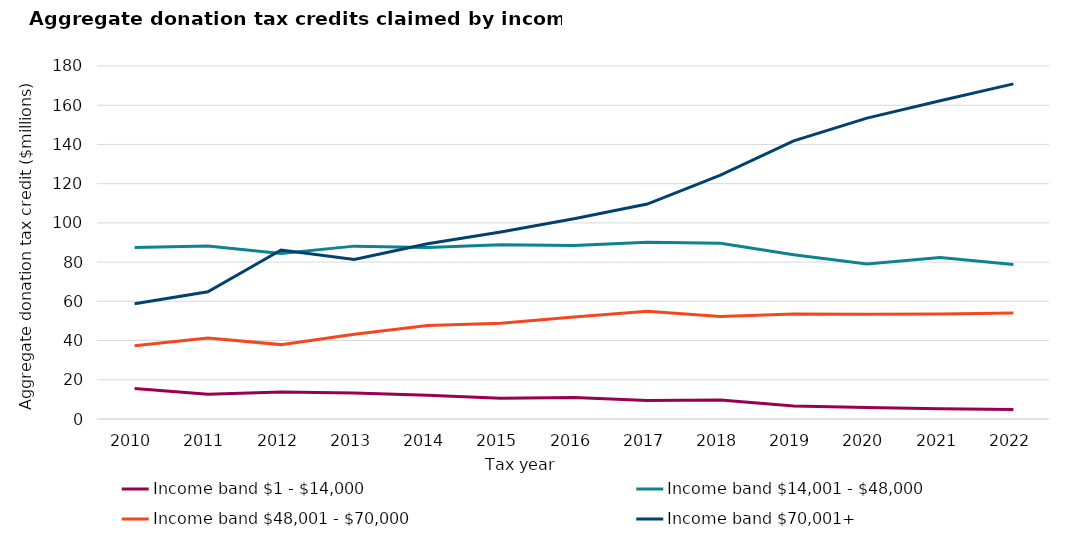
| Category | Income band $1 - $14,000 | Income band $14,001 - $48,000 | Income band $48,001 - $70,000 | Income band $70,001+ |
|---|---|---|---|---|
| 2010.0 | 15.6 | 87.5 | 37.4 | 58.8 |
| 2011.0 | 12.6 | 88.2 | 41.3 | 64.9 |
| 2012.0 | 13.743 | 84.388 | 37.929 | 86.141 |
| 2013.0 | 13.269 | 88.151 | 43.231 | 81.345 |
| 2014.0 | 12.098 | 87.477 | 47.639 | 89.386 |
| 2015.0 | 10.607 | 88.833 | 48.817 | 95.346 |
| 2016.0 | 10.975 | 88.532 | 51.964 | 102.128 |
| 2017.0 | 9.454 | 90.078 | 54.925 | 109.595 |
| 2018.0 | 9.699 | 89.575 | 52.292 | 124.334 |
| 2019.0 | 6.6 | 83.7 | 53.5 | 141.8 |
| 2020.0 | 5.9 | 79.1 | 53.4 | 153.4 |
| 2021.0 | 5.2 | 82.3 | 53.6 | 162.3 |
| 2022.0 | 4.9 | 78.8 | 54 | 170.9 |